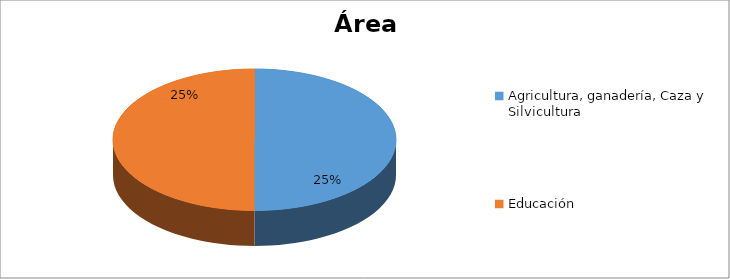
| Category | Series 0 |
|---|---|
| Agricultura, ganadería, Caza y Silvicultura | 0.25 |
| Educación | 0.25 |